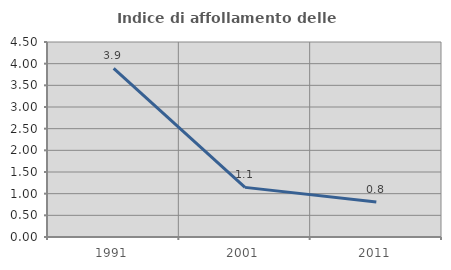
| Category | Indice di affollamento delle abitazioni  |
|---|---|
| 1991.0 | 3.894 |
| 2001.0 | 1.145 |
| 2011.0 | 0.808 |